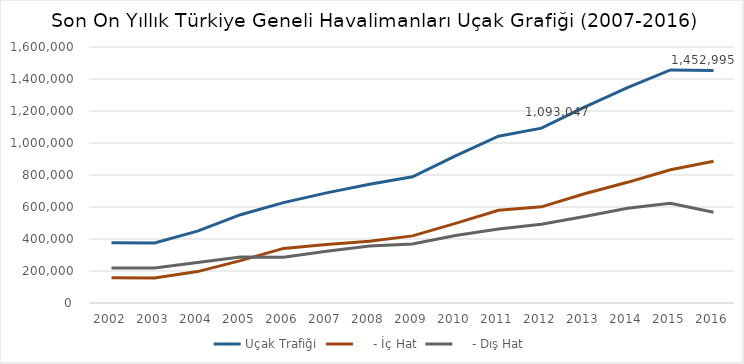
| Category | Uçak Trafiği |     - İç Hat |     - Dış Hat |
|---|---|---|---|
| 2002.0 | 376579 | 157953 | 218626 |
| 2003.0 | 374987 | 156582 | 218405 |
| 2004.0 | 449493 | 196207 | 253286 |
| 2005.0 | 551980 | 265113 | 286867 |
| 2006.0 | 627401 | 341262 | 286139 |
| 2007.0 | 688468 | 365177 | 323291 |
| 2008.0 | 741765 | 385764 | 356001 |
| 2009.0 | 788469 | 419422 | 369047 |
| 2010.0 | 919411 | 497862 | 421549 |
| 2011.0 | 1042369 | 579488 | 462881 |
| 2012.0 | 1093047 | 600818 | 492229 |
| 2013.0 | 1223795 | 682685 | 541110 |
| 2014.0 | 1345954 | 754259 | 591695 |
| 2015.0 | 1456673 | 832958 | 623715 |
| 2016.0 | 1452995 | 886228 | 566767 |